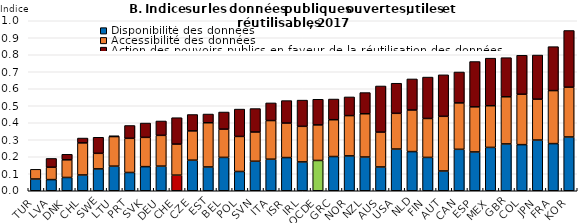
| Category | Disponibilité des données | Accessibilité des données | Action des pouvoirs publics en faveur de la réutilisation des données |
|---|---|---|---|
| TUR | 0.069 | 0.057 | 0 |
| LVA | 0.066 | 0.073 | 0.052 |
| DNK | 0.078 | 0.104 | 0.033 |
| CHL | 0.093 | 0.189 | 0.029 |
| SWE | 0.129 | 0.091 | 0.094 |
| LTU | 0.145 | 0.174 | 0.004 |
| PRT | 0.107 | 0.201 | 0.075 |
| SVK | 0.142 | 0.172 | 0.084 |
| DEU | 0.145 | 0.181 | 0.084 |
| CHE | 0.092 | 0.183 | 0.155 |
| CZE | 0.18 | 0.172 | 0.096 |
| EST | 0.14 | 0.26 | 0.051 |
| BEL | 0.196 | 0.166 | 0.101 |
| POL | 0.113 | 0.206 | 0.161 |
| SVN | 0.173 | 0.172 | 0.138 |
| ITA | 0.186 | 0.227 | 0.104 |
| ISR | 0.195 | 0.203 | 0.132 |
| IRL | 0.17 | 0.209 | 0.154 |
| OCDE | 0.178 | 0.209 | 0.151 |
| GRC | 0.201 | 0.217 | 0.122 |
| NOR | 0.205 | 0.237 | 0.11 |
| NZL | 0.198 | 0.254 | 0.125 |
| AUS | 0.14 | 0.205 | 0.271 |
| USA | 0.245 | 0.21 | 0.177 |
| NLD | 0.23 | 0.245 | 0.183 |
| FIN | 0.196 | 0.229 | 0.243 |
| AUT | 0.116 | 0.322 | 0.244 |
| CAN | 0.244 | 0.273 | 0.182 |
| ESP | 0.228 | 0.265 | 0.267 |
| MEX | 0.255 | 0.245 | 0.28 |
| GBR | 0.275 | 0.277 | 0.23 |
| COL | 0.271 | 0.296 | 0.229 |
| JPN | 0.298 | 0.241 | 0.26 |
| FRA | 0.277 | 0.312 | 0.258 |
| KOR | 0.316 | 0.293 | 0.333 |